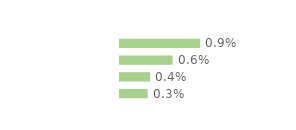
| Category | Series 0 |
|---|---|
| Modeste | 0.009 |
| Médian inférieur | 0.006 |
| Médian supérieur | 0.004 |
| Aisé | 0.003 |